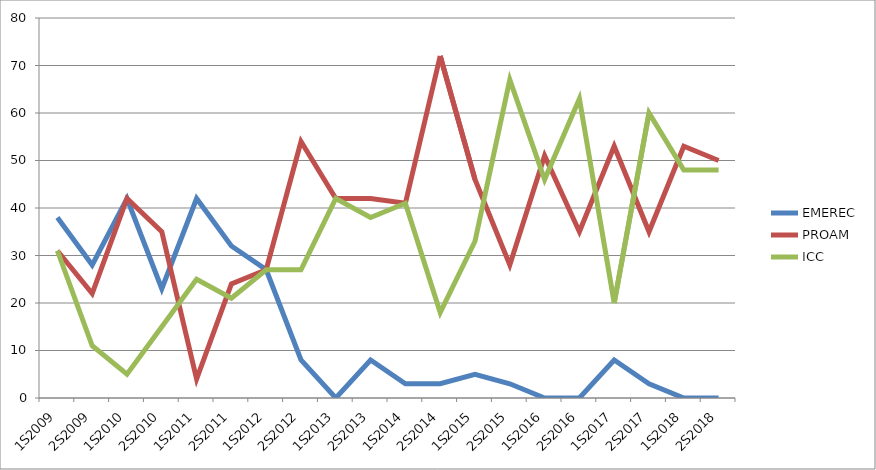
| Category | EMEREC | PROAM | ICC |
|---|---|---|---|
| 1S2009 | 38 | 31 | 31 |
| 2S2009 | 28 | 22 | 11 |
| 1S2010 | 42 | 42 | 5 |
| 2S2010 | 23 | 35 | 15 |
| 1S2011 | 42 | 4 | 25 |
| 2S2011 | 32 | 24 | 21 |
| 1S2012 | 27 | 27 | 27 |
| 2S2012 | 8 | 54 | 27 |
| 1S2013 | 0 | 42 | 42 |
| 2S2013 | 8 | 42 | 38 |
| 1S2014 | 3 | 41 | 41 |
| 2S2014 | 3 | 72 | 18 |
| 1S2015 | 5 | 46 | 33 |
| 2S2015 | 3 | 28 | 67 |
| 1S2016 | 0 | 51 | 46 |
| 2S2016 | 0 | 35 | 63 |
| 1S2017 | 8 | 53 | 20 |
| 2S2017 | 3 | 35 | 60 |
| 1S2018 | 0 | 53 | 48 |
| 2S2018 | 0 | 50 | 48 |